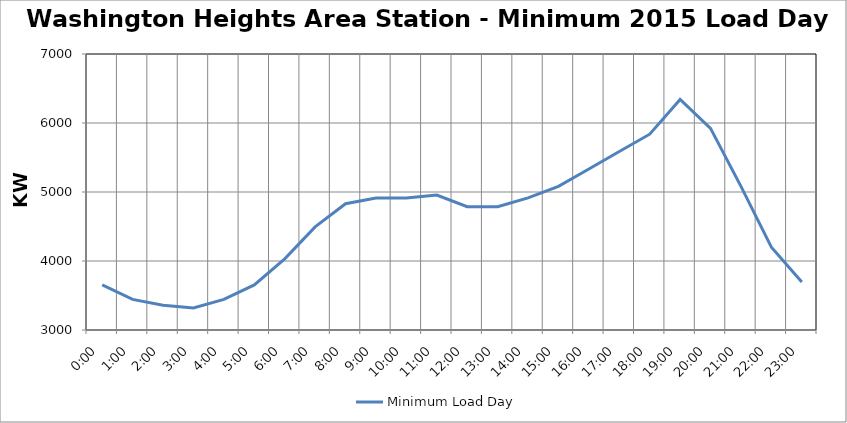
| Category | Minimum Load Day |
|---|---|
| 0.0 | 3654 |
| 0.041666666666666664 | 3444 |
| 0.08333333333333333 | 3360 |
| 0.125 | 3318 |
| 0.16666666666666666 | 3444 |
| 0.20833333333333334 | 3654 |
| 0.25 | 4032 |
| 0.2916666666666667 | 4494 |
| 0.3333333333333333 | 4830 |
| 0.375 | 4914 |
| 0.4166666666666667 | 4914 |
| 0.4583333333333333 | 4956 |
| 0.5 | 4788 |
| 0.5416666666666666 | 4788 |
| 0.5833333333333334 | 4914 |
| 0.625 | 5082 |
| 0.6666666666666666 | 5334 |
| 0.7083333333333334 | 5586 |
| 0.75 | 5838 |
| 0.7916666666666666 | 6342 |
| 0.8333333333333334 | 5922 |
| 0.875 | 5082 |
| 0.9166666666666666 | 4200 |
| 0.9583333333333334 | 3696 |